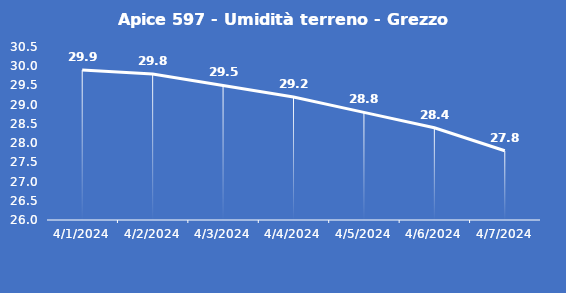
| Category | Apice 597 - Umidità terreno - Grezzo (%VWC) |
|---|---|
| 4/1/24 | 29.9 |
| 4/2/24 | 29.8 |
| 4/3/24 | 29.5 |
| 4/4/24 | 29.2 |
| 4/5/24 | 28.8 |
| 4/6/24 | 28.4 |
| 4/7/24 | 27.8 |